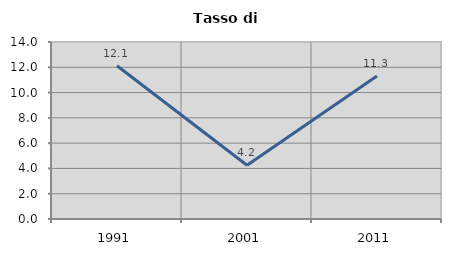
| Category | Tasso di disoccupazione   |
|---|---|
| 1991.0 | 12.118 |
| 2001.0 | 4.247 |
| 2011.0 | 11.313 |